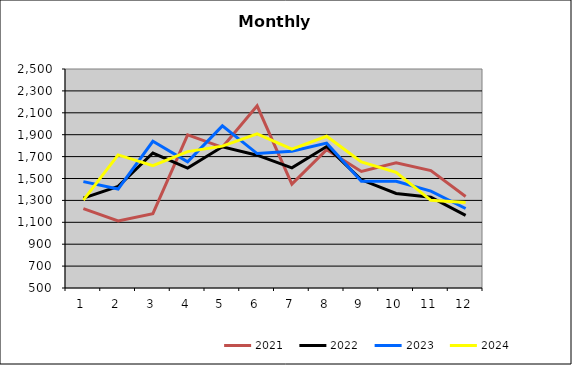
| Category | 2021 | 2022 | 2023 | 2024 |
|---|---|---|---|---|
| 0 | 1224.945 | 1320.378 | 1471.48 | 1303.286 |
| 1 | 1112.955 | 1427.347 | 1403.484 | 1715.816 |
| 2 | 1179.01 | 1732.641 | 1839.49 | 1617.23 |
| 3 | 1897.827 | 1594.906 | 1651.527 | 1745.314 |
| 4 | 1784.624 | 1789.593 | 1980.747 | 1795.398 |
| 5 | 2163.63 | 1712.772 | 1727.791 | 1908.592 |
| 6 | 1448.352 | 1597.715 | 1748.676 | 1768.606 |
| 7 | 1763.243 | 1792.018 | 1822.869 | 1886.119 |
| 8 | 1564.861 | 1487.937 | 1475.586 | 1651.076 |
| 9 | 1643.384 | 1362.939 | 1474.88 | 1556.982 |
| 10 | 1572.259 | 1328.637 | 1384.923 | 1300.586 |
| 11 | 1336.135 | 1163.728 | 1226.284 | 1280.819 |